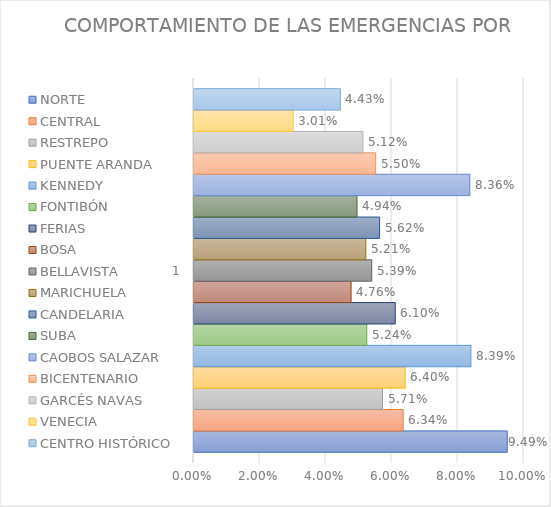
| Category | NORTE | CENTRAL | RESTREPO | PUENTE ARANDA | KENNEDY | FONTIBÓN | FERIAS | BOSA | BELLAVISTA | MARICHUELA | CANDELARIA | SUBA | CAOBOS SALAZAR | BICENTENARIO | GARCÉS NAVAS | VENECIA | CENTRO HISTÓRICO |
|---|---|---|---|---|---|---|---|---|---|---|---|---|---|---|---|---|---|
| 0 | 0.095 | 0.063 | 0.057 | 0.064 | 0.084 | 0.052 | 0.061 | 0.048 | 0.054 | 0.052 | 0.056 | 0.049 | 0.084 | 0.055 | 0.051 | 0.03 | 0.044 |